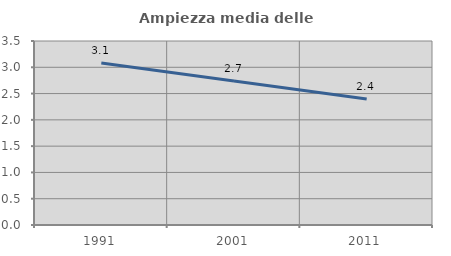
| Category | Ampiezza media delle famiglie |
|---|---|
| 1991.0 | 3.082 |
| 2001.0 | 2.739 |
| 2011.0 | 2.397 |